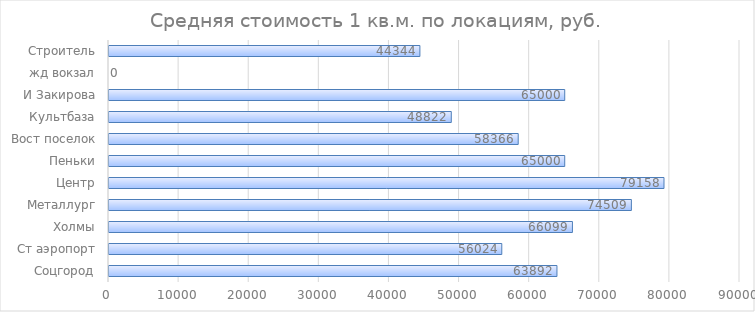
| Category | Series 0 |
|---|---|
| Соцгород | 63891.973 |
| Ст аэропорт | 56024.425 |
| Холмы | 66099.402 |
| Металлург | 74508.891 |
| Центр | 79158.162 |
| Пеньки | 65000 |
| Вост поселок | 58365.999 |
| Культбаза | 48821.686 |
| И Закирова | 65000 |
| жд вокзал | 0 |
| Строитель | 44343.575 |